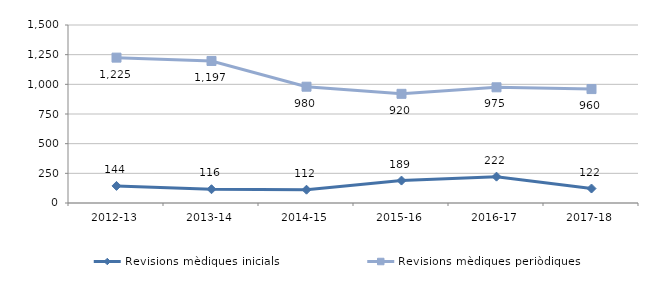
| Category | Revisions mèdiques inicials | Revisions mèdiques periòdiques |
|---|---|---|
| 2012-13 | 144 | 1225 |
| 2013-14 | 116 | 1197 |
| 2014-15 | 112 | 980 |
| 2015-16 | 189 | 920 |
| 2016-17 | 222 | 975 |
| 2017-18 | 122 | 960 |